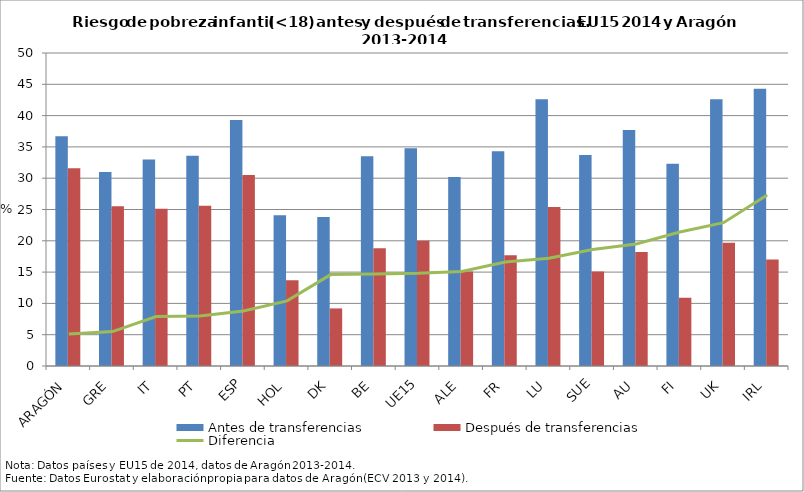
| Category | Antes de transferencias | Después de transferencias |
|---|---|---|
| ARAGÓN | 36.7 | 31.6 |
| GRE | 31 | 25.5 |
| IT | 33 | 25.1 |
| PT | 33.6 | 25.6 |
| ESP | 39.3 | 30.5 |
| HOL | 24.1 | 13.7 |
| DK | 23.8 | 9.2 |
| BE | 33.5 | 18.8 |
| UE15 | 34.8 | 20 |
| ALE | 30.2 | 15.1 |
| FR | 34.3 | 17.7 |
| LU | 42.6 | 25.4 |
| SUE | 33.7 | 15.1 |
| AU | 37.7 | 18.2 |
| FI | 32.3 | 10.9 |
| UK | 42.6 | 19.7 |
| IRL | 44.3 | 17 |